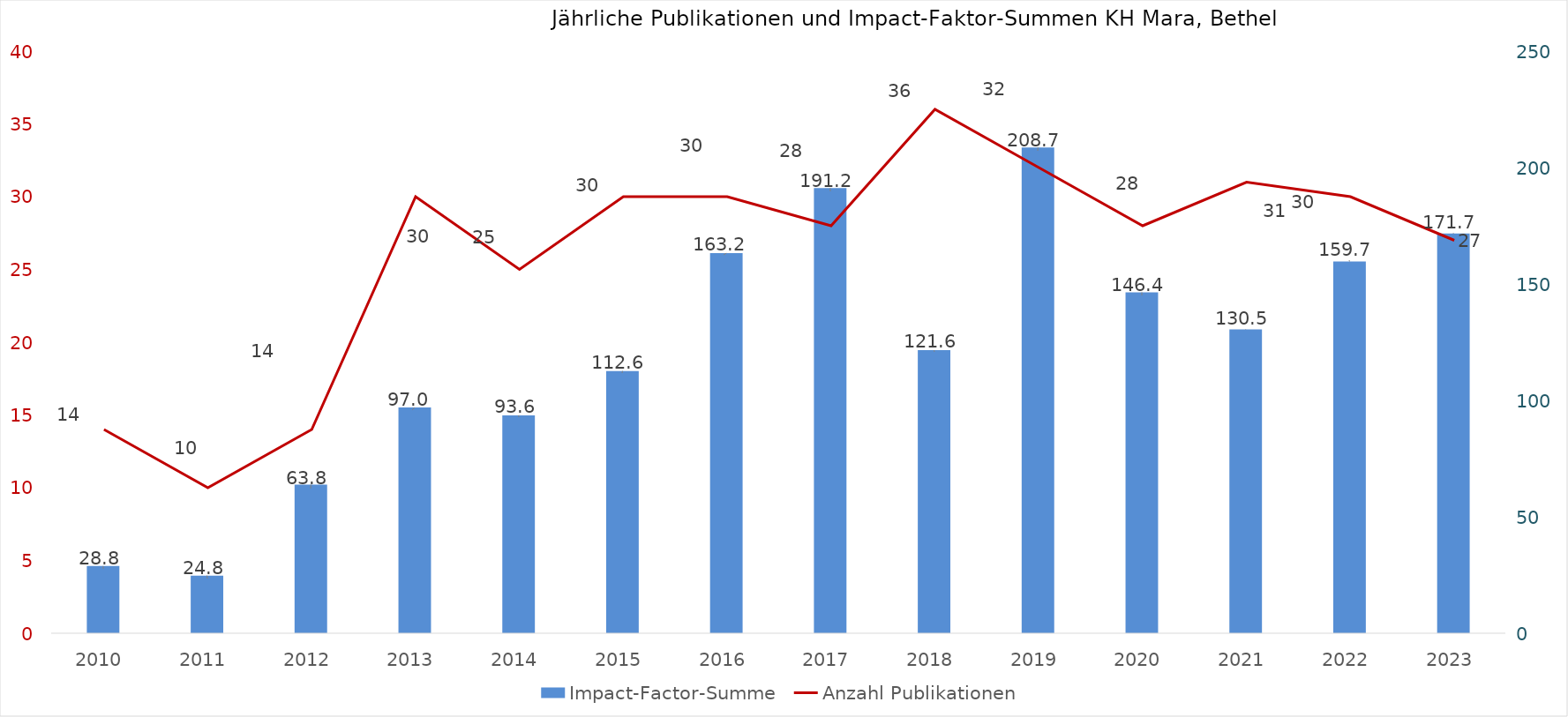
| Category | Impact-Factor-Summe |
|---|---|
| 2010.0 | 28.849 |
| 2011.0 | 24.76 |
| 2012.0 | 63.813 |
| 2013.0 | 96.978 |
| 2014.0 | 93.585 |
| 2015.0 | 112.639 |
| 2016.0 | 163.229 |
| 2017.0 | 191.201 |
| 2018.0 | 121.567 |
| 2019.0 | 208.664 |
| 2020.0 | 146.426 |
| 2021.0 | 130.492 |
| 2022.0 | 159.668 |
| 2023.0 | 171.7 |